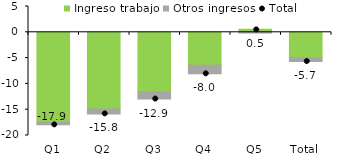
| Category | Ingreso trabajo | Otros ingresos |
|---|---|---|
| Q1 | -17.455 | -0.485 |
| Q2 | -14.875 | -0.935 |
| Q3 | -11.545 | -1.393 |
| Q4 | -6.399 | -1.649 |
| Q5 | 0.608 | -0.143 |
| Total | -4.942 | -0.725 |